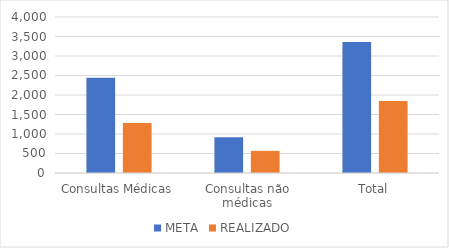
| Category | META | REALIZADO |
|---|---|---|
| Consultas Médicas | 2442 | 1282 |
| Consultas não médicas | 916 | 567 |
| Total | 3358 | 1849 |